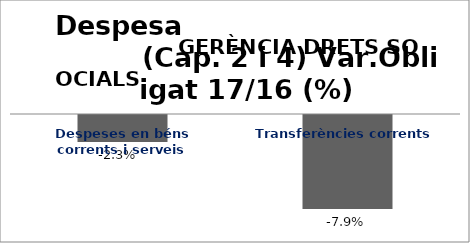
| Category | Series 0 |
|---|---|
| Despeses en béns corrents i serveis | -0.023 |
| Transferències corrents | -0.079 |